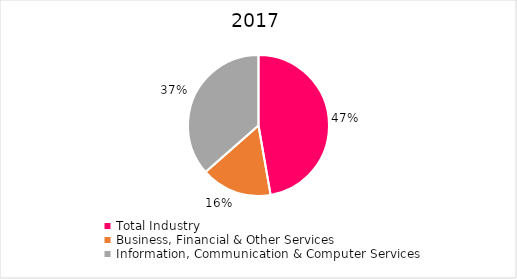
| Category | Series 0 |
|---|---|
| Total Industry | 95783 |
| Business, Financial & Other Services | 32997 |
| Information, Communication & Computer Services | 73923 |